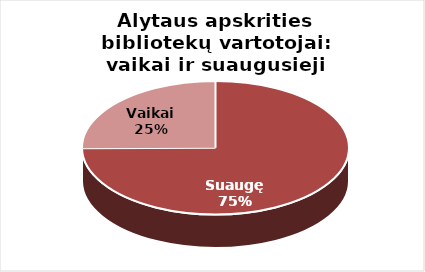
| Category | Series 0 |
|---|---|
| Suaugę | 21653 |
| Vaikai | 7273 |